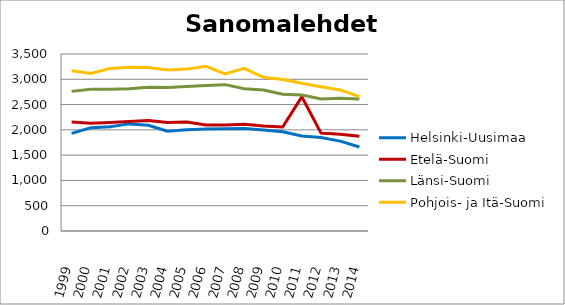
| Category | Helsinki-Uusimaa | Etelä-Suomi | Länsi-Suomi | Pohjois- ja Itä-Suomi |
|---|---|---|---|---|
| 1999.0 | 1930 | 2157 | 2761 | 3167 |
| 2000.0 | 2042 | 2132 | 2804 | 3117 |
| 2001.0 | 2061 | 2145 | 2803 | 3215 |
| 2002.0 | 2118 | 2164 | 2811 | 3238 |
| 2003.0 | 2091 | 2186 | 2841 | 3233 |
| 2004.0 | 1972 | 2146 | 2838 | 3186 |
| 2005.0 | 2003 | 2153 | 2856 | 3201 |
| 2006.0 | 2017 | 2097 | 2879 | 3257 |
| 2007.0 | 2022 | 2094 | 2894 | 3105 |
| 2008.0 | 2026 | 2109 | 2815 | 3215 |
| 2009.0 | 1997 | 2076 | 2789 | 3039 |
| 2010.0 | 1963 | 2055 | 2704 | 2994 |
| 2011.0 | 1879 | 2653 | 2689 | 2920 |
| 2012.0 | 1847 | 1936 | 2609 | 2852 |
| 2013.0 | 1777 | 1913 | 2626 | 2789 |
| 2014.0 | 1662 | 1872 | 2610 | 2657 |